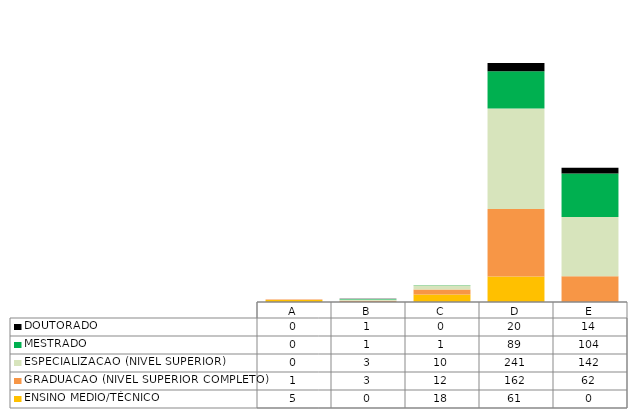
| Category | ENSINO MEDIO/TÉCNICO | GRADUACAO (NIVEL SUPERIOR COMPLETO) | ESPECIALIZACAO (NIVEL SUPERIOR) | MESTRADO | DOUTORADO |
|---|---|---|---|---|---|
| A | 5 | 1 | 0 | 0 | 0 |
| B | 0 | 3 | 3 | 1 | 1 |
| C | 18 | 12 | 10 | 1 | 0 |
| D | 61 | 162 | 241 | 89 | 20 |
| E | 0 | 62 | 142 | 104 | 14 |